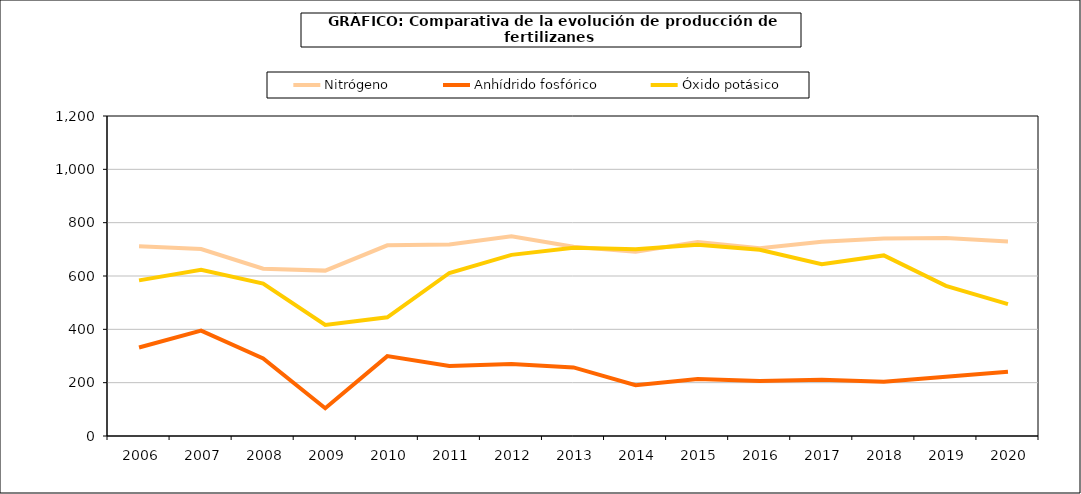
| Category | Nitrógeno | Anhídrido fosfórico | Óxido potásico |
|---|---|---|---|
|   2006 | 711.4 | 331.7 | 583.6 |
|   2007 | 701.022 | 394.992 | 623.095 |
|   2008 | 627.3 | 291.1 | 571.7 |
|   2009 | 620.2 | 104.3 | 416.7 |
|   2010 | 715 | 299.5 | 445.3 |
|   2011 | 718.1 | 262.6 | 611.3 |
|   2012 | 748.9 | 269.7 | 679.2 |
|   2013 | 710 | 257.1 | 706.3 |
|   2014 | 691.1 | 190.6 | 700 |
|   2015 | 727.2 | 214 | 717.2 |
|   2016 | 703.8 | 206 | 698.2 |
|   2017 | 728 | 211.3 | 643.9 |
|   2018 | 740.8 | 203.6 | 677.2 |
|   2019 | 742.4 | 222.1 | 562.9 |
|   2020 | 729.8 | 240.7 | 494.3 |